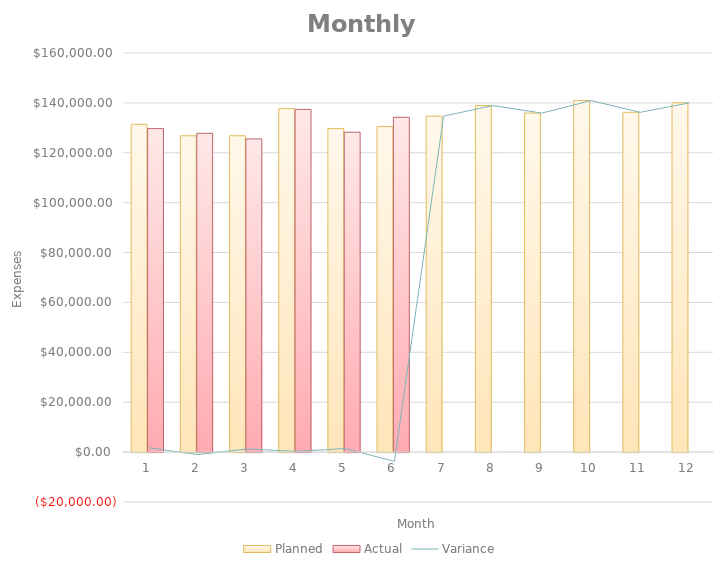
| Category | Planned | Actual |
|---|---|---|
| 0 | 131420 | 129682 |
| 1 | 126820 | 127804 |
| 2 | 126820 | 125565 |
| 3 | 137695 | 137394 |
| 4 | 129695 | 128255 |
| 5 | 130495 | 134239 |
| 6 | 134695 | 0 |
| 7 | 138918 | 0 |
| 8 | 135918 | 0 |
| 9 | 140918 | 0 |
| 10 | 136218 | 0 |
| 11 | 140018 | 0 |